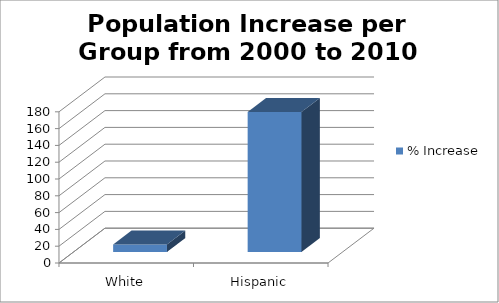
| Category | % Increase |
|---|---|
| White | 8.899 |
| Hispanic | 166.667 |